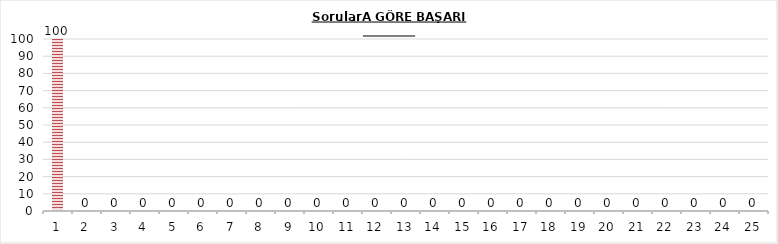
| Category | Series 0 |
|---|---|
| 0 | 100 |
| 1 | 0 |
| 2 | 0 |
| 3 | 0 |
| 4 | 0 |
| 5 | 0 |
| 6 | 0 |
| 7 | 0 |
| 8 | 0 |
| 9 | 0 |
| 10 | 0 |
| 11 | 0 |
| 12 | 0 |
| 13 | 0 |
| 14 | 0 |
| 15 | 0 |
| 16 | 0 |
| 17 | 0 |
| 18 | 0 |
| 19 | 0 |
| 20 | 0 |
| 21 | 0 |
| 22 | 0 |
| 23 | 0 |
| 24 | 0 |